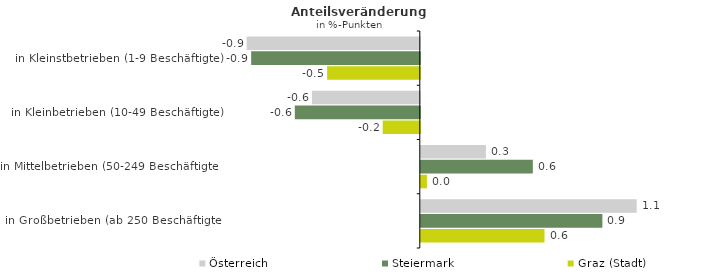
| Category | Österreich | Steiermark | Graz (Stadt) |
|---|---|---|---|
| in Kleinstbetrieben (1-9 Beschäftigte) | -0.898 | -0.875 | -0.481 |
| in Kleinbetrieben (10-49 Beschäftigte) | -0.559 | -0.648 | -0.193 |
| in Mittelbetrieben (50-249 Beschäftigte) | 0.338 | 0.581 | 0.032 |
| in Großbetrieben (ab 250 Beschäftigte) | 1.12 | 0.942 | 0.642 |